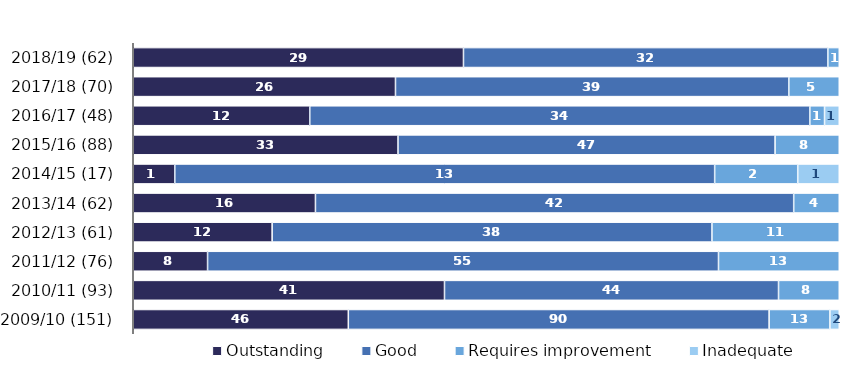
| Category | Outstanding | Good | Requires improvement | Inadequate |
|---|---|---|---|---|
| 2018/19 (62) | 29 | 32 | 1 | 0 |
| 2017/18 (70) | 26 | 39 | 5 | 0 |
| 2016/17 (48) | 12 | 34 | 1 | 1 |
| 2015/16 (88) | 33 | 47 | 8 | 0 |
| 2014/15 (17) | 1 | 13 | 2 | 1 |
| 2013/14 (62) | 16 | 42 | 4 | 0 |
| 2012/13 (61) | 12 | 38 | 11 | 0 |
| 2011/12 (76) | 8 | 55 | 13 | 0 |
| 2010/11 (93) | 41 | 44 | 8 | 0 |
| 2009/10 (151) | 46 | 90 | 13 | 2 |